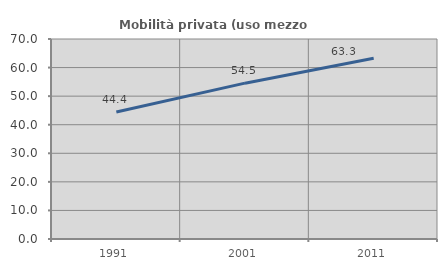
| Category | Mobilità privata (uso mezzo privato) |
|---|---|
| 1991.0 | 44.42 |
| 2001.0 | 54.545 |
| 2011.0 | 63.289 |